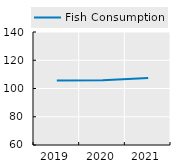
| Category | Fish Consumption |
|---|---|
| 2019.0 | 105.608 |
| 2020.0 | 105.781 |
| 2021.0 | 107.364 |